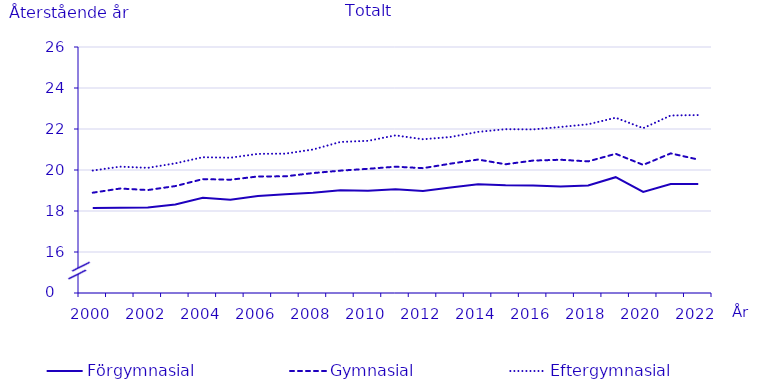
| Category | Förgymnasial | Gymnasial | Eftergymnasial |
|---|---|---|---|
| 2000.0 | 18.146 | 18.893 | 19.974 |
| 2001.0 | 18.158 | 19.096 | 20.164 |
| 2002.0 | 18.167 | 19.022 | 20.105 |
| 2003.0 | 18.318 | 19.216 | 20.325 |
| 2004.0 | 18.646 | 19.555 | 20.623 |
| 2005.0 | 18.552 | 19.526 | 20.6 |
| 2006.0 | 18.73 | 19.685 | 20.787 |
| 2007.0 | 18.817 | 19.691 | 20.798 |
| 2008.0 | 18.885 | 19.85 | 20.999 |
| 2009.0 | 19.016 | 19.969 | 21.369 |
| 2010.0 | 18.989 | 20.058 | 21.422 |
| 2011.0 | 19.066 | 20.161 | 21.69 |
| 2012.0 | 18.98 | 20.09 | 21.5 |
| 2013.0 | 19.15 | 20.31 | 21.61 |
| 2014.0 | 19.31 | 20.51 | 21.86 |
| 2015.0 | 19.26 | 20.28 | 21.99 |
| 2016.0 | 19.24 | 20.46 | 21.98 |
| 2017.0 | 19.2 | 20.5 | 22.1 |
| 2018.0 | 19.24 | 20.42 | 22.23 |
| 2019.0 | 19.65 | 20.79 | 22.55 |
| 2020.0 | 18.93 | 20.25 | 22.04 |
| 2021.0 | 19.32 | 20.81 | 22.66 |
| 2022.0 | 19.32 | 20.51 | 22.68 |